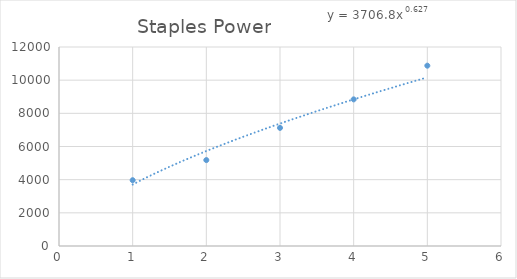
| Category | Staples |
|---|---|
| 5.0 | 10874 |
| 4.0 | 8842 |
| 3.0 | 7123 |
| 2.0 | 5181 |
| 1.0 | 3968 |